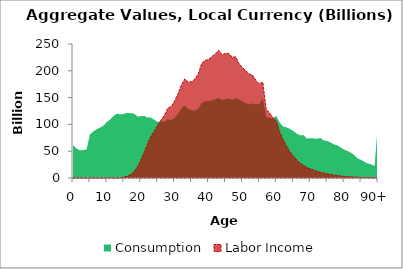
| Category | Consumption | Labor Income |
|---|---|---|
| 0 | 61183.022 | 0 |
|  | 55293.412 | 0 |
| 2 | 51647.346 | 0 |
| 3 | 52099.493 | 0 |
| 4 | 53172.123 | 0 |
| 5 | 81195.68 | 0 |
| 6 | 86869.706 | 0 |
| 7 | 90910.472 | 0 |
| 8 | 94006.297 | 0 |
| 9 | 97654.648 | 0 |
| 10 | 104589.859 | 0 |
| 11 | 109186.446 | 0 |
| 12 | 115767.026 | 0 |
| 13 | 120292.683 | 0 |
| 14 | 118715.714 | 0 |
| 15 | 119597.629 | 1836.582 |
| 16 | 121452.558 | 3369.057 |
| 17 | 120997.668 | 6335.394 |
| 18 | 120097.737 | 11874.366 |
| 19 | 114883.93 | 20335.561 |
| 20 | 115079.091 | 33020.912 |
| 21 | 115874.117 | 47925.708 |
| 22 | 112675.521 | 63759.84 |
| 23 | 112645.203 | 78238.916 |
| 24 | 108580.11 | 87596.829 |
| 25 | 104640.051 | 98393.539 |
| 26 | 105815.69 | 108272.261 |
| 27 | 105120.812 | 117258.15 |
| 28 | 109611.813 | 130387.407 |
| 29 | 108489.311 | 133420.456 |
| 30 | 112150.392 | 143772.462 |
| 31 | 120073.002 | 157340.266 |
| 32 | 129831.449 | 173773.14 |
| 33 | 135362.146 | 184900.087 |
| 34 | 129180.486 | 178775.74 |
| 35 | 126623.593 | 179819.387 |
| 36 | 125617.369 | 184655.36 |
| 37 | 129490.215 | 194944.477 |
| 38 | 140310.636 | 214045.334 |
| 39 | 143285.266 | 219430.099 |
| 40 | 143433.128 | 221096.292 |
| 41 | 144942.326 | 226594.753 |
| 42 | 147093.415 | 231377.635 |
| 43 | 149596.791 | 238021.884 |
| 44 | 144907.637 | 229665.774 |
| 45 | 147348.661 | 232469.709 |
| 46 | 148308.113 | 232520.057 |
| 47 | 145922.493 | 225255.722 |
| 48 | 149392.47 | 226011.346 |
| 49 | 146123.938 | 213290.576 |
| 50 | 142911.835 | 206071.802 |
| 51 | 139515.776 | 200121.228 |
| 52 | 137291.264 | 194161.504 |
| 53 | 139253.361 | 191716.833 |
| 54 | 137257.146 | 181887.82 |
| 55 | 138230.968 | 175588.261 |
| 56 | 148044.313 | 178951.598 |
| 57 | 112828.085 | 128156.447 |
| 58 | 112701.294 | 121513.876 |
| 59 | 110994 | 112638.74 |
| 60 | 115908.232 | 106456.012 |
| 61 | 103397.499 | 85909.253 |
| 62 | 96072.136 | 71195.191 |
| 63 | 94536.033 | 59777.808 |
| 64 | 91472.056 | 49010.081 |
| 65 | 87727.823 | 41403.711 |
| 66 | 82952.658 | 33758.965 |
| 67 | 79548.177 | 27890.837 |
| 68 | 80140.506 | 23689.149 |
| 69 | 73573.713 | 19388.443 |
| 70 | 74185.222 | 17129.736 |
| 71 | 74013.922 | 14806.59 |
| 72 | 73226.699 | 12530.238 |
| 73 | 74681.23 | 10845.773 |
| 74 | 70090.172 | 9214.226 |
| 75 | 69159.166 | 7971.338 |
| 76 | 66267.483 | 6658.831 |
| 77 | 62690.01 | 5528.191 |
| 78 | 60948.1 | 4720.98 |
| 79 | 56833.683 | 3871.013 |
| 80 | 52903.952 | 3089.087 |
| 81 | 50596.898 | 2897.76 |
| 82 | 47239.244 | 2025.462 |
| 83 | 42749.072 | 1857.392 |
| 84 | 36455.197 | 1424.766 |
| 85 | 33943.239 | 1020.119 |
| 86 | 30032.075 | 768.552 |
| 87 | 26953.828 | 765.944 |
| 88 | 25479.006 | 636.432 |
| 89 | 22513.944 | 507.366 |
| 90+ | 103439.575 | 1797.533 |